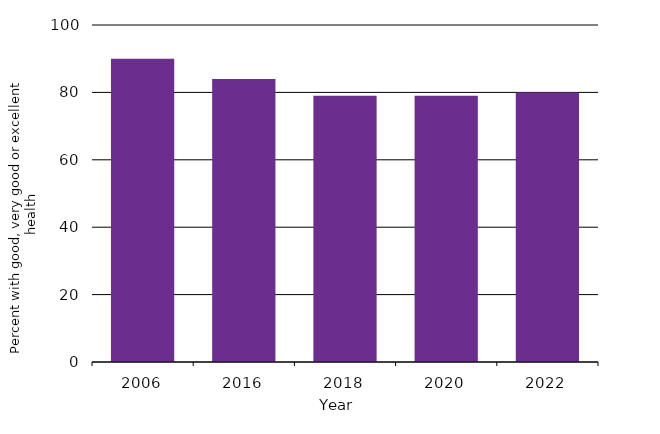
| Category | Percent with good, very good or excellent health |
|---|---|
| 2006.0 | 90 |
| 2016.0 | 84 |
| 2018.0 | 79 |
| 2020.0 | 79 |
| 2022.0 | 80 |